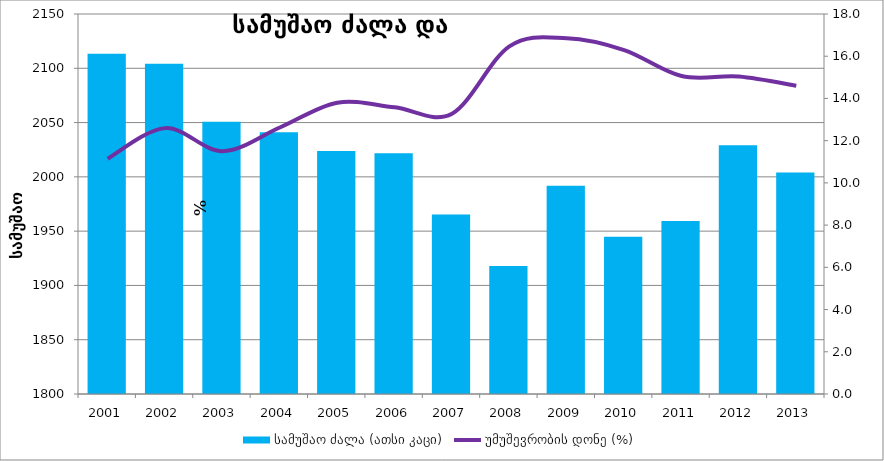
| Category | სამუშაო ძალა (ათსი კაცი) |
|---|---|
| 2001.0 | 2113.3 |
| 2002.0 | 2104.2 |
| 2003.0 | 2050.8 |
| 2004.0 | 2041 |
| 2005.0 | 2023.9 |
| 2006.0 | 2021.8 |
| 2007.0 | 1965.3 |
| 2008.0 | 1917.8 |
| 2009.0 | 1991.8 |
| 2010.0 | 1944.9 |
| 2011.0 | 1959.3 |
| 2012.0 | 2029.1 |
| 2013.0 | 2003.9 |